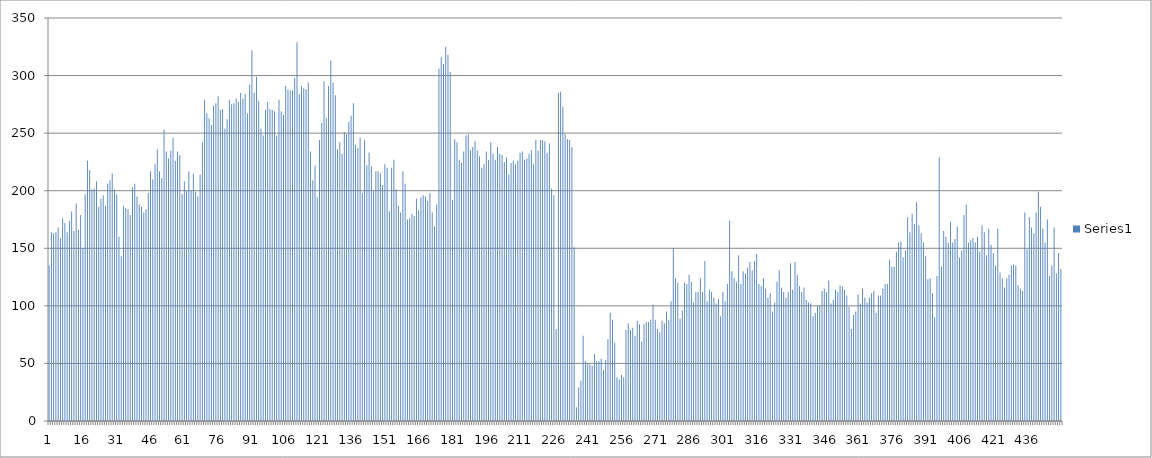
| Category | Series 0 |
|---|---|
| 0 | 135 |
| 1 | 164 |
| 2 | 163 |
| 3 | 164 |
| 4 | 168 |
| 5 | 159 |
| 6 | 176 |
| 7 | 172 |
| 8 | 164 |
| 9 | 174 |
| 10 | 182 |
| 11 | 165 |
| 12 | 189 |
| 13 | 166 |
| 14 | 179 |
| 15 | 150 |
| 16 | 197 |
| 17 | 226 |
| 18 | 218 |
| 19 | 201 |
| 20 | 202 |
| 21 | 208 |
| 22 | 186 |
| 23 | 193 |
| 24 | 196 |
| 25 | 187 |
| 26 | 206 |
| 27 | 209 |
| 28 | 215 |
| 29 | 201 |
| 30 | 197 |
| 31 | 160 |
| 32 | 143 |
| 33 | 187 |
| 34 | 185 |
| 35 | 184 |
| 36 | 179 |
| 37 | 203 |
| 38 | 206 |
| 39 | 195 |
| 40 | 188 |
| 41 | 186 |
| 42 | 181 |
| 43 | 184 |
| 44 | 198 |
| 45 | 217 |
| 46 | 210 |
| 47 | 223 |
| 48 | 236 |
| 49 | 217 |
| 50 | 211 |
| 51 | 253 |
| 52 | 234 |
| 53 | 228 |
| 54 | 235 |
| 55 | 246 |
| 56 | 226 |
| 57 | 234 |
| 58 | 231 |
| 59 | 197 |
| 60 | 208 |
| 61 | 200 |
| 62 | 217 |
| 63 | 200 |
| 64 | 215 |
| 65 | 199 |
| 66 | 195 |
| 67 | 214 |
| 68 | 242 |
| 69 | 279 |
| 70 | 267 |
| 71 | 263 |
| 72 | 257 |
| 73 | 274 |
| 74 | 276 |
| 75 | 282 |
| 76 | 270 |
| 77 | 271 |
| 78 | 254 |
| 79 | 262 |
| 80 | 279 |
| 81 | 275 |
| 82 | 276 |
| 83 | 280 |
| 84 | 277 |
| 85 | 285 |
| 86 | 280 |
| 87 | 284 |
| 88 | 267 |
| 89 | 292 |
| 90 | 322 |
| 91 | 285 |
| 92 | 299 |
| 93 | 278 |
| 94 | 254 |
| 95 | 248 |
| 96 | 270 |
| 97 | 277 |
| 98 | 271 |
| 99 | 270 |
| 100 | 269 |
| 101 | 248 |
| 102 | 279 |
| 103 | 269 |
| 104 | 266 |
| 105 | 291 |
| 106 | 288 |
| 107 | 287 |
| 108 | 287 |
| 109 | 298 |
| 110 | 329 |
| 111 | 284 |
| 112 | 291 |
| 113 | 289 |
| 114 | 288 |
| 115 | 294 |
| 116 | 234 |
| 117 | 209 |
| 118 | 222 |
| 119 | 194 |
| 120 | 244 |
| 121 | 259 |
| 122 | 295 |
| 123 | 263 |
| 124 | 291 |
| 125 | 313 |
| 126 | 294 |
| 127 | 283 |
| 128 | 236 |
| 129 | 242 |
| 130 | 232 |
| 131 | 251 |
| 132 | 249 |
| 133 | 260 |
| 134 | 265 |
| 135 | 276 |
| 136 | 240 |
| 137 | 237 |
| 138 | 246 |
| 139 | 198 |
| 140 | 244 |
| 141 | 222 |
| 142 | 233 |
| 143 | 221 |
| 144 | 200 |
| 145 | 217 |
| 146 | 217 |
| 147 | 215 |
| 148 | 205 |
| 149 | 223 |
| 150 | 220 |
| 151 | 182 |
| 152 | 220 |
| 153 | 227 |
| 154 | 201 |
| 155 | 187 |
| 156 | 181 |
| 157 | 217 |
| 158 | 206 |
| 159 | 175 |
| 160 | 176 |
| 161 | 180 |
| 162 | 178 |
| 163 | 193 |
| 164 | 183 |
| 165 | 194 |
| 166 | 196 |
| 167 | 195 |
| 168 | 191 |
| 169 | 198 |
| 170 | 181 |
| 171 | 169 |
| 172 | 188 |
| 173 | 306 |
| 174 | 316 |
| 175 | 310 |
| 176 | 325 |
| 177 | 318 |
| 178 | 303 |
| 179 | 192 |
| 180 | 245 |
| 181 | 242 |
| 182 | 227 |
| 183 | 224 |
| 184 | 234 |
| 185 | 248 |
| 186 | 249 |
| 187 | 235 |
| 188 | 238 |
| 189 | 243 |
| 190 | 235 |
| 191 | 230 |
| 192 | 220 |
| 193 | 223 |
| 194 | 234 |
| 195 | 227 |
| 196 | 242 |
| 197 | 232 |
| 198 | 227 |
| 199 | 238 |
| 200 | 232 |
| 201 | 231 |
| 202 | 225 |
| 203 | 229 |
| 204 | 214 |
| 205 | 224 |
| 206 | 226 |
| 207 | 223 |
| 208 | 226 |
| 209 | 233 |
| 210 | 234 |
| 211 | 227 |
| 212 | 228 |
| 213 | 232 |
| 214 | 235 |
| 215 | 223 |
| 216 | 244 |
| 217 | 235 |
| 218 | 244 |
| 219 | 244 |
| 220 | 243 |
| 221 | 233 |
| 222 | 241 |
| 223 | 202 |
| 224 | 196 |
| 225 | 80 |
| 226 | 285 |
| 227 | 286 |
| 228 | 273 |
| 229 | 249 |
| 230 | 245 |
| 231 | 244 |
| 232 | 238 |
| 233 | 151 |
| 234 | 12 |
| 235 | 29 |
| 236 | 35 |
| 237 | 74 |
| 238 | 52 |
| 239 | 50 |
| 240 | 49 |
| 241 | 48 |
| 242 | 58 |
| 243 | 52 |
| 244 | 52 |
| 245 | 54 |
| 246 | 44 |
| 247 | 53 |
| 248 | 71 |
| 249 | 94 |
| 250 | 88 |
| 251 | 68 |
| 252 | 38 |
| 253 | 36 |
| 254 | 40 |
| 255 | 38 |
| 256 | 79 |
| 257 | 85 |
| 258 | 79 |
| 259 | 81 |
| 260 | 74 |
| 261 | 87 |
| 262 | 84 |
| 263 | 69 |
| 264 | 84 |
| 265 | 86 |
| 266 | 86 |
| 267 | 88 |
| 268 | 101 |
| 269 | 88 |
| 270 | 80 |
| 271 | 77 |
| 272 | 87 |
| 273 | 85 |
| 274 | 95 |
| 275 | 88 |
| 276 | 104 |
| 277 | 150 |
| 278 | 124 |
| 279 | 120 |
| 280 | 89 |
| 281 | 96 |
| 282 | 120 |
| 283 | 119 |
| 284 | 127 |
| 285 | 121 |
| 286 | 103 |
| 287 | 112 |
| 288 | 112 |
| 289 | 124 |
| 290 | 112 |
| 291 | 139 |
| 292 | 104 |
| 293 | 114 |
| 294 | 112 |
| 295 | 107 |
| 296 | 102 |
| 297 | 106 |
| 298 | 91 |
| 299 | 112 |
| 300 | 104 |
| 301 | 119 |
| 302 | 174 |
| 303 | 130 |
| 304 | 124 |
| 305 | 121 |
| 306 | 144 |
| 307 | 119 |
| 308 | 130 |
| 309 | 128 |
| 310 | 133 |
| 311 | 138 |
| 312 | 131 |
| 313 | 139 |
| 314 | 145 |
| 315 | 119 |
| 316 | 117 |
| 317 | 124 |
| 318 | 115 |
| 319 | 107 |
| 320 | 111 |
| 321 | 95 |
| 322 | 103 |
| 323 | 121 |
| 324 | 131 |
| 325 | 116 |
| 326 | 112 |
| 327 | 107 |
| 328 | 112 |
| 329 | 137 |
| 330 | 114 |
| 331 | 138 |
| 332 | 127 |
| 333 | 117 |
| 334 | 112 |
| 335 | 116 |
| 336 | 105 |
| 337 | 103 |
| 338 | 102 |
| 339 | 91 |
| 340 | 94 |
| 341 | 100 |
| 342 | 100 |
| 343 | 113 |
| 344 | 115 |
| 345 | 112 |
| 346 | 122 |
| 347 | 102 |
| 348 | 105 |
| 349 | 114 |
| 350 | 112 |
| 351 | 118 |
| 352 | 117 |
| 353 | 114 |
| 354 | 109 |
| 355 | 99 |
| 356 | 80 |
| 357 | 92 |
| 358 | 95 |
| 359 | 110 |
| 360 | 102 |
| 361 | 115 |
| 362 | 107 |
| 363 | 103 |
| 364 | 107 |
| 365 | 111 |
| 366 | 113 |
| 367 | 94 |
| 368 | 109 |
| 369 | 109 |
| 370 | 115 |
| 371 | 119 |
| 372 | 119 |
| 373 | 140 |
| 374 | 134 |
| 375 | 134 |
| 376 | 147 |
| 377 | 155 |
| 378 | 156 |
| 379 | 142 |
| 380 | 148 |
| 381 | 177 |
| 382 | 164 |
| 383 | 180 |
| 384 | 171 |
| 385 | 190 |
| 386 | 170 |
| 387 | 163 |
| 388 | 155 |
| 389 | 143 |
| 390 | 123 |
| 391 | 124 |
| 392 | 111 |
| 393 | 90 |
| 394 | 126 |
| 395 | 229 |
| 396 | 134 |
| 397 | 165 |
| 398 | 160 |
| 399 | 155 |
| 400 | 173 |
| 401 | 155 |
| 402 | 158 |
| 403 | 169 |
| 404 | 142 |
| 405 | 148 |
| 406 | 179 |
| 407 | 188 |
| 408 | 155 |
| 409 | 157 |
| 410 | 159 |
| 411 | 155 |
| 412 | 160 |
| 413 | 147 |
| 414 | 170 |
| 415 | 164 |
| 416 | 144 |
| 417 | 167 |
| 418 | 153 |
| 419 | 146 |
| 420 | 135 |
| 421 | 167 |
| 422 | 129 |
| 423 | 124 |
| 424 | 116 |
| 425 | 124 |
| 426 | 127 |
| 427 | 135 |
| 428 | 136 |
| 429 | 135 |
| 430 | 118 |
| 431 | 115 |
| 432 | 113 |
| 433 | 181 |
| 434 | 149 |
| 435 | 177 |
| 436 | 168 |
| 437 | 163 |
| 438 | 181 |
| 439 | 199 |
| 440 | 186 |
| 441 | 167 |
| 442 | 155 |
| 443 | 175 |
| 444 | 126 |
| 445 | 135 |
| 446 | 168 |
| 447 | 128 |
| 448 | 146 |
| 449 | 132 |